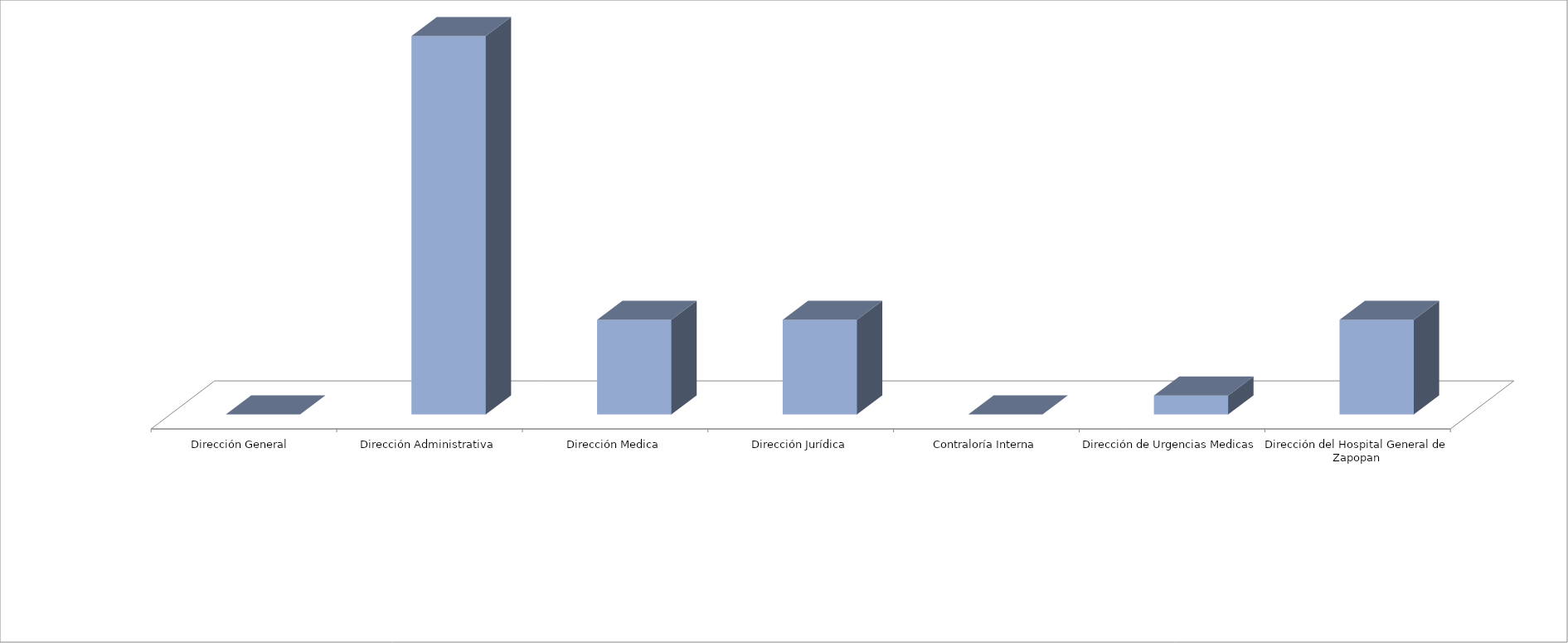
| Category | Series 0 | Series 1 |
|---|---|---|
| Dirección General  |  | 0 |
| Dirección Administrativa |  | 20 |
| Dirección Medica |  | 5 |
| Dirección Jurídica |  | 5 |
| Contraloría Interna |  | 0 |
| Dirección de Urgencias Medicas |  | 1 |
| Dirección del Hospital General de Zapopan |  | 5 |